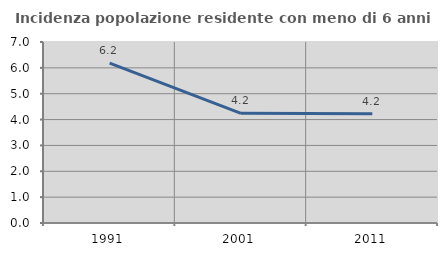
| Category | Incidenza popolazione residente con meno di 6 anni |
|---|---|
| 1991.0 | 6.186 |
| 2001.0 | 4.241 |
| 2011.0 | 4.225 |